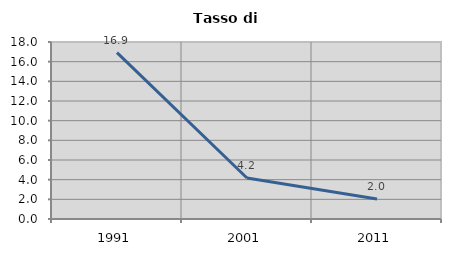
| Category | Tasso di disoccupazione   |
|---|---|
| 1991.0 | 16.923 |
| 2001.0 | 4.167 |
| 2011.0 | 2.041 |